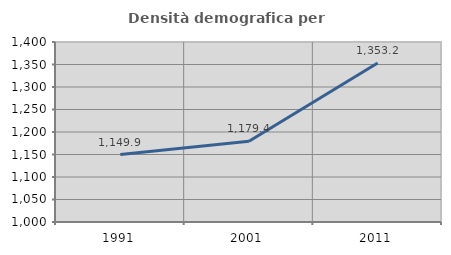
| Category | Densità demografica |
|---|---|
| 1991.0 | 1149.867 |
| 2001.0 | 1179.427 |
| 2011.0 | 1353.237 |